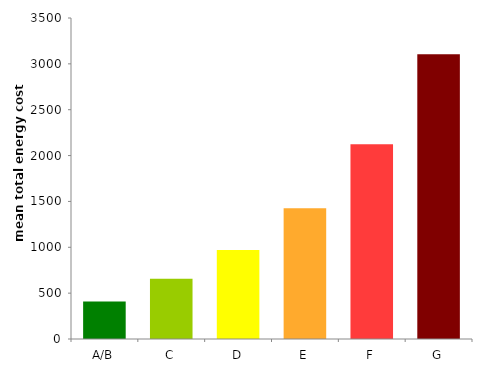
| Category | 2016 |
|---|---|
| A/B | 410.113 |
| C | 657.348 |
| D | 970.092 |
| E | 1424.573 |
| F | 2123.997 |
| G | 3104.51 |